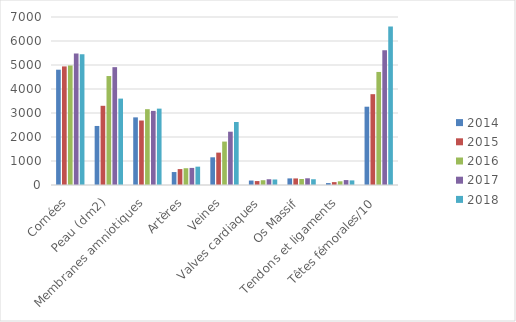
| Category | 2014 | 2015 | 2016 | 2017 | 2018 |
|---|---|---|---|---|---|
| Cornées | 4804 | 4941 | 4979 | 5481 | 5448 |
| Peau (dm2) | 2460 | 3300 | 4540 | 4910 | 3600 |
| Membranes amniotiques | 2818 | 2687 | 3159 | 3088 | 3182 |
| Artères | 540 | 663 | 699 | 712 | 764 |
| Veines | 1154 | 1349 | 1809 | 2221 | 2625 |
| Valves cardiaques | 186 | 164 | 199 | 240 | 230 |
| Os Massif | 275 | 274 | 249 | 280 | 240 |
| Tendons et ligaments | 80 | 120 | 154 | 205 | 192 |
| Têtes fémorales/10 | 3262.3 | 3784.3 | 4710.6 | 5615.5 | 6599.9 |